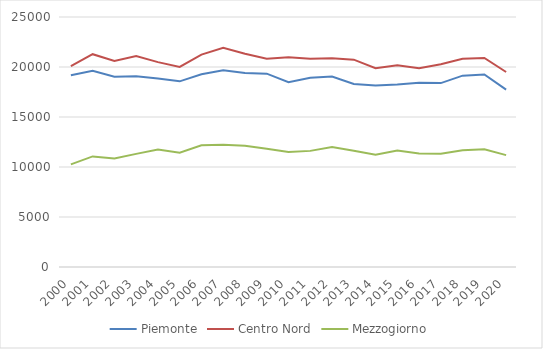
| Category | Piemonte | Centro Nord | Mezzogiorno |
|---|---|---|---|
| 2000 | 19168.253 | 20085.226 | 10258.378 |
| 2001 | 19613.467 | 21282.454 | 11059.901 |
| 2002 | 19020.938 | 20593.856 | 10841.022 |
| 2003 | 19067.365 | 21100.113 | 11311.652 |
| 2004 | 18847.349 | 20487.57 | 11756.77 |
| 2005 | 18566.015 | 20006.395 | 11435.09 |
| 2006 | 19274.221 | 21239.022 | 12169.013 |
| 2007 | 19664.186 | 21930.919 | 12218.27 |
| 2008 | 19402.481 | 21333.78 | 12130.218 |
| 2009 | 19331.639 | 20819.515 | 11827.795 |
| 2010 | 18484.593 | 20974.64 | 11494.26 |
| 2011 | 18913.571 | 20833.218 | 11612.417 |
| 2012 | 19051.783 | 20865.967 | 11997.351 |
| 2013 | 18305.373 | 20733.257 | 11622.804 |
| 2014 | 18142.054 | 19878.104 | 11216.87 |
| 2015 | 18245.348 | 20185.558 | 11647.125 |
| 2016 | 18427.121 | 19880.431 | 11344.346 |
| 2017 | 18387.94 | 20273.985 | 11326.222 |
| 2018 | 19133.389 | 20821.923 | 11677.428 |
| 2019 | 19253.846 | 20905.308 | 11764.2 |
| 2020 | 17740.039 | 19500.727 | 11188.603 |